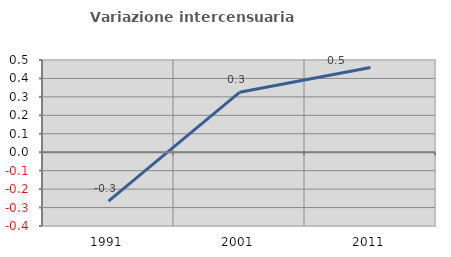
| Category | Variazione intercensuaria annua |
|---|---|
| 1991.0 | -0.265 |
| 2001.0 | 0.325 |
| 2011.0 | 0.459 |